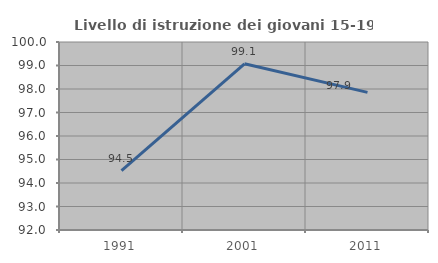
| Category | Livello di istruzione dei giovani 15-19 anni |
|---|---|
| 1991.0 | 94.531 |
| 2001.0 | 99.074 |
| 2011.0 | 97.857 |